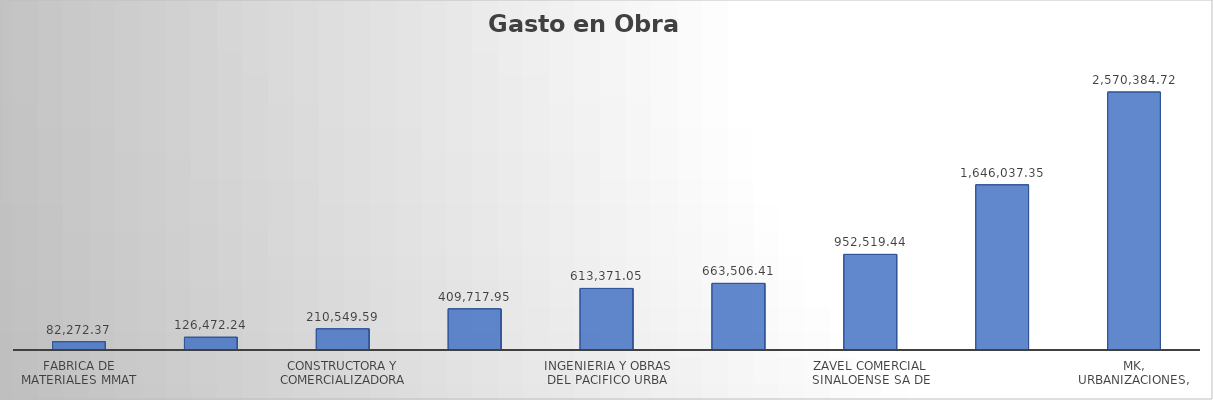
| Category | Suma |
|---|---|
| FABRICA DE MATERIALES MMAT SA DE CV | 82272.37 |
| CHAPEM SA DE CV | 126472.24 |
| CONSTRUCTORA Y COMERCIALIZADORA ERKAN SA DE CV | 210549.59 |
| BOJORQUEZ BAEZ MIGUEL ANGEL | 409717.95 |
| INGENIERIA Y OBRAS DEL PACIFICO URBA SA DE V | 613371.05 |
| SALLAS CASTILLO MANUEL | 663506.41 |
| ZAVEL COMERCIAL SINALOENSE SA DE CV. | 952519.44 |
| CONSTRUCTORA FALOIC, SA DE CV | 1646037.35 |
| MK, URBANIZACIONES, S.A DE C.V. | 2570384.72 |